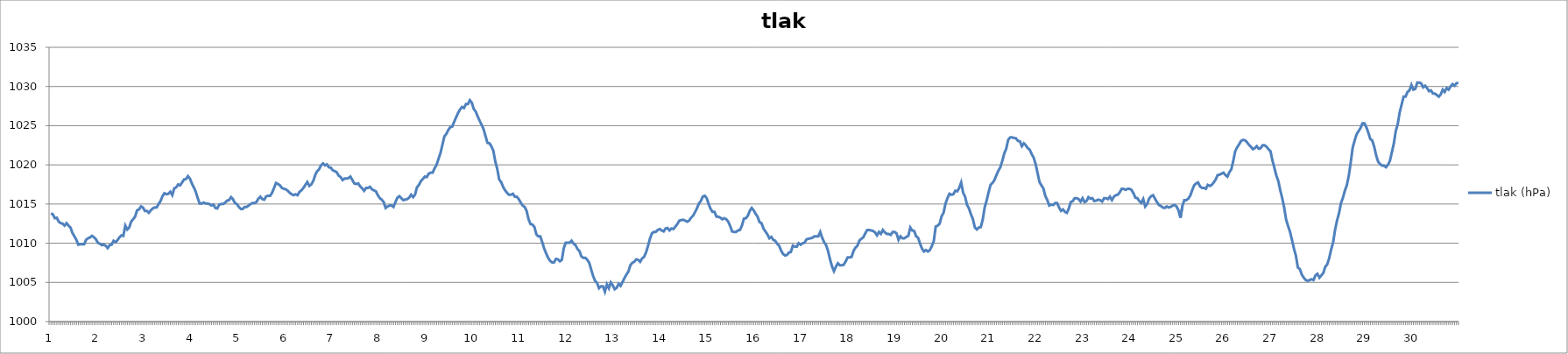
| Category | tlak (hPa) |
|---|---|
| 0 | 1013.81 |
| 1 | 1013.69 |
| 2 | 1013.19 |
| 3 | 1013.25 |
| 4 | 1012.75 |
| 5 | 1012.56 |
| 6 | 1012.5 |
| 7 | 1012.25 |
| 8 | 1012.56 |
| 9 | 1012.25 |
| 10 | 1012 |
| 11 | 1011.31 |
| 12 | 1010.88 |
| 13 | 1010.44 |
| 14 | 1009.81 |
| 15 | 1009.88 |
| 16 | 1009.88 |
| 17 | 1009.88 |
| 18 | 1010.44 |
| 19 | 1010.63 |
| 20 | 1010.75 |
| 21 | 1010.94 |
| 22 | 1010.75 |
| 23 | 1010.5 |
| 24 | 1010.06 |
| 25 | 1009.94 |
| 26 | 1009.75 |
| 27 | 1009.81 |
| 28 | 1009.69 |
| 29 | 1009.38 |
| 30 | 1009.75 |
| 31 | 1009.81 |
| 32 | 1010.31 |
| 33 | 1010.13 |
| 34 | 1010.38 |
| 35 | 1010.75 |
| 36 | 1011 |
| 37 | 1010.94 |
| 38 | 1012.25 |
| 39 | 1011.75 |
| 40 | 1012 |
| 41 | 1012.75 |
| 42 | 1013.06 |
| 43 | 1013.38 |
| 44 | 1014.19 |
| 45 | 1014.31 |
| 46 | 1014.69 |
| 47 | 1014.56 |
| 48 | 1014.13 |
| 49 | 1014.13 |
| 50 | 1013.88 |
| 51 | 1014.19 |
| 52 | 1014.44 |
| 53 | 1014.56 |
| 54 | 1014.56 |
| 55 | 1015 |
| 56 | 1015.38 |
| 57 | 1016 |
| 58 | 1016.38 |
| 59 | 1016.25 |
| 60 | 1016.31 |
| 61 | 1016.56 |
| 62 | 1016.13 |
| 63 | 1017 |
| 64 | 1017.13 |
| 65 | 1017.5 |
| 66 | 1017.38 |
| 67 | 1017.75 |
| 68 | 1018.13 |
| 69 | 1018.19 |
| 70 | 1018.56 |
| 71 | 1018.25 |
| 72 | 1017.63 |
| 73 | 1017.13 |
| 74 | 1016.56 |
| 75 | 1015.75 |
| 76 | 1015.06 |
| 77 | 1015.06 |
| 78 | 1015.19 |
| 79 | 1015.06 |
| 80 | 1015.06 |
| 81 | 1015 |
| 82 | 1014.81 |
| 83 | 1014.94 |
| 84 | 1014.5 |
| 85 | 1014.44 |
| 86 | 1014.94 |
| 87 | 1015 |
| 88 | 1015 |
| 89 | 1015.19 |
| 90 | 1015.44 |
| 91 | 1015.5 |
| 92 | 1015.88 |
| 93 | 1015.63 |
| 94 | 1015.13 |
| 95 | 1015 |
| 96 | 1014.63 |
| 97 | 1014.38 |
| 98 | 1014.38 |
| 99 | 1014.63 |
| 100 | 1014.63 |
| 101 | 1014.81 |
| 102 | 1015 |
| 103 | 1015.13 |
| 104 | 1015.13 |
| 105 | 1015.25 |
| 106 | 1015.69 |
| 107 | 1015.94 |
| 108 | 1015.63 |
| 109 | 1015.56 |
| 110 | 1016 |
| 111 | 1016.06 |
| 112 | 1016.06 |
| 113 | 1016.44 |
| 114 | 1017.06 |
| 115 | 1017.69 |
| 116 | 1017.56 |
| 117 | 1017.38 |
| 118 | 1017.06 |
| 119 | 1016.94 |
| 120 | 1016.88 |
| 121 | 1016.69 |
| 122 | 1016.44 |
| 123 | 1016.25 |
| 124 | 1016.13 |
| 125 | 1016.25 |
| 126 | 1016.13 |
| 127 | 1016.56 |
| 128 | 1016.75 |
| 129 | 1017.06 |
| 130 | 1017.44 |
| 131 | 1017.81 |
| 132 | 1017.31 |
| 133 | 1017.5 |
| 134 | 1017.94 |
| 135 | 1018.69 |
| 136 | 1019.19 |
| 137 | 1019.44 |
| 138 | 1019.94 |
| 139 | 1020.19 |
| 140 | 1019.94 |
| 141 | 1020.06 |
| 142 | 1019.69 |
| 143 | 1019.63 |
| 144 | 1019.31 |
| 145 | 1019.19 |
| 146 | 1019.06 |
| 147 | 1018.63 |
| 148 | 1018.44 |
| 149 | 1018.06 |
| 150 | 1018.25 |
| 151 | 1018.25 |
| 152 | 1018.31 |
| 153 | 1018.5 |
| 154 | 1018.06 |
| 155 | 1017.63 |
| 156 | 1017.56 |
| 157 | 1017.63 |
| 158 | 1017.25 |
| 159 | 1017 |
| 160 | 1016.69 |
| 161 | 1017.06 |
| 162 | 1017.06 |
| 163 | 1017.19 |
| 164 | 1016.88 |
| 165 | 1016.75 |
| 166 | 1016.63 |
| 167 | 1016.13 |
| 168 | 1015.75 |
| 169 | 1015.56 |
| 170 | 1015.25 |
| 171 | 1014.5 |
| 172 | 1014.69 |
| 173 | 1014.81 |
| 174 | 1014.81 |
| 175 | 1014.63 |
| 176 | 1015.25 |
| 177 | 1015.81 |
| 178 | 1016 |
| 179 | 1015.75 |
| 180 | 1015.5 |
| 181 | 1015.56 |
| 182 | 1015.63 |
| 183 | 1015.81 |
| 184 | 1016.19 |
| 185 | 1015.88 |
| 186 | 1016.19 |
| 187 | 1017.13 |
| 188 | 1017.44 |
| 189 | 1017.94 |
| 190 | 1018.19 |
| 191 | 1018.5 |
| 192 | 1018.44 |
| 193 | 1018.88 |
| 194 | 1019 |
| 195 | 1019 |
| 196 | 1019.56 |
| 197 | 1020 |
| 198 | 1020.75 |
| 199 | 1021.5 |
| 200 | 1022.56 |
| 201 | 1023.63 |
| 202 | 1023.94 |
| 203 | 1024.44 |
| 204 | 1024.81 |
| 205 | 1024.88 |
| 206 | 1025.5 |
| 207 | 1026.06 |
| 208 | 1026.63 |
| 209 | 1027.06 |
| 210 | 1027.38 |
| 211 | 1027.25 |
| 212 | 1027.75 |
| 213 | 1027.75 |
| 214 | 1028.25 |
| 215 | 1027.94 |
| 216 | 1027.13 |
| 217 | 1026.81 |
| 218 | 1026.19 |
| 219 | 1025.63 |
| 220 | 1025.13 |
| 221 | 1024.56 |
| 222 | 1023.69 |
| 223 | 1022.81 |
| 224 | 1022.75 |
| 225 | 1022.38 |
| 226 | 1021.81 |
| 227 | 1020.44 |
| 228 | 1019.5 |
| 229 | 1018.13 |
| 230 | 1017.81 |
| 231 | 1017.19 |
| 232 | 1016.75 |
| 233 | 1016.44 |
| 234 | 1016.19 |
| 235 | 1016.19 |
| 236 | 1016.31 |
| 237 | 1015.94 |
| 238 | 1015.94 |
| 239 | 1015.63 |
| 240 | 1015.19 |
| 241 | 1014.81 |
| 242 | 1014.63 |
| 243 | 1014.13 |
| 244 | 1013.06 |
| 245 | 1012.44 |
| 246 | 1012.38 |
| 247 | 1012.06 |
| 248 | 1011.13 |
| 249 | 1010.88 |
| 250 | 1010.88 |
| 251 | 1010.13 |
| 252 | 1009.31 |
| 253 | 1008.69 |
| 254 | 1008.13 |
| 255 | 1007.75 |
| 256 | 1007.56 |
| 257 | 1007.56 |
| 258 | 1008 |
| 259 | 1007.94 |
| 260 | 1007.69 |
| 261 | 1007.88 |
| 262 | 1009.38 |
| 263 | 1010.06 |
| 264 | 1010.06 |
| 265 | 1010.06 |
| 266 | 1010.31 |
| 267 | 1009.94 |
| 268 | 1009.75 |
| 269 | 1009.25 |
| 270 | 1009 |
| 271 | 1008.31 |
| 272 | 1008.13 |
| 273 | 1008.13 |
| 274 | 1007.88 |
| 275 | 1007.5 |
| 276 | 1006.63 |
| 277 | 1005.81 |
| 278 | 1005.19 |
| 279 | 1004.94 |
| 280 | 1004.25 |
| 281 | 1004.5 |
| 282 | 1004.5 |
| 283 | 1003.81 |
| 284 | 1004.75 |
| 285 | 1004.25 |
| 286 | 1005 |
| 287 | 1004.63 |
| 288 | 1004.13 |
| 289 | 1004.31 |
| 290 | 1004.81 |
| 291 | 1004.56 |
| 292 | 1005.06 |
| 293 | 1005.56 |
| 294 | 1006 |
| 295 | 1006.38 |
| 296 | 1007.19 |
| 297 | 1007.5 |
| 298 | 1007.63 |
| 299 | 1007.94 |
| 300 | 1007.88 |
| 301 | 1007.63 |
| 302 | 1008.06 |
| 303 | 1008.25 |
| 304 | 1008.81 |
| 305 | 1009.63 |
| 306 | 1010.56 |
| 307 | 1011.25 |
| 308 | 1011.44 |
| 309 | 1011.44 |
| 310 | 1011.69 |
| 311 | 1011.81 |
| 312 | 1011.63 |
| 313 | 1011.5 |
| 314 | 1011.88 |
| 315 | 1011.94 |
| 316 | 1011.63 |
| 317 | 1011.88 |
| 318 | 1011.81 |
| 319 | 1012.13 |
| 320 | 1012.44 |
| 321 | 1012.88 |
| 322 | 1012.94 |
| 323 | 1013 |
| 324 | 1012.88 |
| 325 | 1012.75 |
| 326 | 1012.88 |
| 327 | 1013.25 |
| 328 | 1013.5 |
| 329 | 1013.94 |
| 330 | 1014.44 |
| 331 | 1015.06 |
| 332 | 1015.38 |
| 333 | 1015.94 |
| 334 | 1016.06 |
| 335 | 1015.75 |
| 336 | 1015 |
| 337 | 1014.38 |
| 338 | 1014 |
| 339 | 1014 |
| 340 | 1013.38 |
| 341 | 1013.38 |
| 342 | 1013.25 |
| 343 | 1013.06 |
| 344 | 1013.19 |
| 345 | 1013.06 |
| 346 | 1012.75 |
| 347 | 1012.19 |
| 348 | 1011.5 |
| 349 | 1011.44 |
| 350 | 1011.44 |
| 351 | 1011.63 |
| 352 | 1011.69 |
| 353 | 1012.25 |
| 354 | 1013.13 |
| 355 | 1013.19 |
| 356 | 1013.5 |
| 357 | 1014.13 |
| 358 | 1014.5 |
| 359 | 1014.19 |
| 360 | 1013.75 |
| 361 | 1013.38 |
| 362 | 1012.69 |
| 363 | 1012.56 |
| 364 | 1011.88 |
| 365 | 1011.5 |
| 366 | 1011.13 |
| 367 | 1010.63 |
| 368 | 1010.81 |
| 369 | 1010.44 |
| 370 | 1010.31 |
| 371 | 1009.94 |
| 372 | 1009.69 |
| 373 | 1009.06 |
| 374 | 1008.63 |
| 375 | 1008.44 |
| 376 | 1008.5 |
| 377 | 1008.81 |
| 378 | 1008.88 |
| 379 | 1009.69 |
| 380 | 1009.56 |
| 381 | 1009.56 |
| 382 | 1010 |
| 383 | 1009.81 |
| 384 | 1010 |
| 385 | 1010.06 |
| 386 | 1010.5 |
| 387 | 1010.56 |
| 388 | 1010.63 |
| 389 | 1010.69 |
| 390 | 1010.88 |
| 391 | 1010.88 |
| 392 | 1010.88 |
| 393 | 1011.44 |
| 394 | 1010.69 |
| 395 | 1010.13 |
| 396 | 1009.75 |
| 397 | 1009 |
| 398 | 1007.94 |
| 399 | 1007.06 |
| 400 | 1006.44 |
| 401 | 1007 |
| 402 | 1007.44 |
| 403 | 1007.19 |
| 404 | 1007.19 |
| 405 | 1007.25 |
| 406 | 1007.69 |
| 407 | 1008.19 |
| 408 | 1008.19 |
| 409 | 1008.25 |
| 410 | 1009 |
| 411 | 1009.44 |
| 412 | 1009.69 |
| 413 | 1010.31 |
| 414 | 1010.56 |
| 415 | 1010.75 |
| 416 | 1011.25 |
| 417 | 1011.69 |
| 418 | 1011.69 |
| 419 | 1011.63 |
| 420 | 1011.56 |
| 421 | 1011.38 |
| 422 | 1011 |
| 423 | 1011.44 |
| 424 | 1011.19 |
| 425 | 1011.69 |
| 426 | 1011.38 |
| 427 | 1011.19 |
| 428 | 1011.19 |
| 429 | 1011.06 |
| 430 | 1011.44 |
| 431 | 1011.44 |
| 432 | 1011.25 |
| 433 | 1010.44 |
| 434 | 1010.88 |
| 435 | 1010.63 |
| 436 | 1010.63 |
| 437 | 1010.81 |
| 438 | 1010.94 |
| 439 | 1012 |
| 440 | 1011.63 |
| 441 | 1011.56 |
| 442 | 1010.88 |
| 443 | 1010.69 |
| 444 | 1009.94 |
| 445 | 1009.31 |
| 446 | 1008.94 |
| 447 | 1009.13 |
| 448 | 1008.94 |
| 449 | 1009.13 |
| 450 | 1009.63 |
| 451 | 1010.25 |
| 452 | 1012.13 |
| 453 | 1012.25 |
| 454 | 1012.5 |
| 455 | 1013.44 |
| 456 | 1013.88 |
| 457 | 1015.06 |
| 458 | 1015.75 |
| 459 | 1016.31 |
| 460 | 1016.19 |
| 461 | 1016.25 |
| 462 | 1016.69 |
| 463 | 1016.63 |
| 464 | 1017.06 |
| 465 | 1017.75 |
| 466 | 1016.44 |
| 467 | 1015.94 |
| 468 | 1014.88 |
| 469 | 1014.44 |
| 470 | 1013.69 |
| 471 | 1013.06 |
| 472 | 1012 |
| 473 | 1011.75 |
| 474 | 1012 |
| 475 | 1012.06 |
| 476 | 1013 |
| 477 | 1014.56 |
| 478 | 1015.44 |
| 479 | 1016.5 |
| 480 | 1017.44 |
| 481 | 1017.69 |
| 482 | 1018.06 |
| 483 | 1018.69 |
| 484 | 1019.25 |
| 485 | 1019.69 |
| 486 | 1020.5 |
| 487 | 1021.44 |
| 488 | 1022.06 |
| 489 | 1023.19 |
| 490 | 1023.5 |
| 491 | 1023.5 |
| 492 | 1023.44 |
| 493 | 1023.38 |
| 494 | 1023.06 |
| 495 | 1023 |
| 496 | 1022.38 |
| 497 | 1022.75 |
| 498 | 1022.5 |
| 499 | 1022.13 |
| 500 | 1021.94 |
| 501 | 1021.38 |
| 502 | 1020.94 |
| 503 | 1020.13 |
| 504 | 1019 |
| 505 | 1017.81 |
| 506 | 1017.38 |
| 507 | 1017 |
| 508 | 1016 |
| 509 | 1015.5 |
| 510 | 1014.81 |
| 511 | 1014.94 |
| 512 | 1014.88 |
| 513 | 1015.13 |
| 514 | 1015.13 |
| 515 | 1014.56 |
| 516 | 1014.13 |
| 517 | 1014.31 |
| 518 | 1014 |
| 519 | 1013.88 |
| 520 | 1014.44 |
| 521 | 1015.25 |
| 522 | 1015.38 |
| 523 | 1015.75 |
| 524 | 1015.75 |
| 525 | 1015.63 |
| 526 | 1015.31 |
| 527 | 1015.75 |
| 528 | 1015.25 |
| 529 | 1015.38 |
| 530 | 1015.88 |
| 531 | 1015.69 |
| 532 | 1015.75 |
| 533 | 1015.38 |
| 534 | 1015.44 |
| 535 | 1015.56 |
| 536 | 1015.5 |
| 537 | 1015.31 |
| 538 | 1015.75 |
| 539 | 1015.75 |
| 540 | 1015.63 |
| 541 | 1015.94 |
| 542 | 1015.5 |
| 543 | 1015.94 |
| 544 | 1016.13 |
| 545 | 1016.19 |
| 546 | 1016.5 |
| 547 | 1016.94 |
| 548 | 1016.94 |
| 549 | 1016.81 |
| 550 | 1016.94 |
| 551 | 1016.94 |
| 552 | 1016.81 |
| 553 | 1016.38 |
| 554 | 1015.81 |
| 555 | 1015.75 |
| 556 | 1015.38 |
| 557 | 1015.13 |
| 558 | 1015.63 |
| 559 | 1014.69 |
| 560 | 1015 |
| 561 | 1015.69 |
| 562 | 1016 |
| 563 | 1016.13 |
| 564 | 1015.69 |
| 565 | 1015.25 |
| 566 | 1014.88 |
| 567 | 1014.75 |
| 568 | 1014.56 |
| 569 | 1014.5 |
| 570 | 1014.69 |
| 571 | 1014.56 |
| 572 | 1014.63 |
| 573 | 1014.81 |
| 574 | 1014.88 |
| 575 | 1014.69 |
| 576 | 1014.19 |
| 577 | 1013.25 |
| 578 | 1014.75 |
| 579 | 1015.5 |
| 580 | 1015.5 |
| 581 | 1015.69 |
| 582 | 1016.06 |
| 583 | 1016.75 |
| 584 | 1017.38 |
| 585 | 1017.63 |
| 586 | 1017.75 |
| 587 | 1017.25 |
| 588 | 1017.06 |
| 589 | 1017.06 |
| 590 | 1016.94 |
| 591 | 1017.44 |
| 592 | 1017.31 |
| 593 | 1017.44 |
| 594 | 1017.75 |
| 595 | 1018.13 |
| 596 | 1018.69 |
| 597 | 1018.75 |
| 598 | 1018.88 |
| 599 | 1019 |
| 600 | 1018.69 |
| 601 | 1018.5 |
| 602 | 1019.06 |
| 603 | 1019.44 |
| 604 | 1020.5 |
| 605 | 1021.75 |
| 606 | 1022.25 |
| 607 | 1022.63 |
| 608 | 1023.06 |
| 609 | 1023.19 |
| 610 | 1023.13 |
| 611 | 1022.88 |
| 612 | 1022.56 |
| 613 | 1022.31 |
| 614 | 1022 |
| 615 | 1022.13 |
| 616 | 1022.38 |
| 617 | 1022.06 |
| 618 | 1022.13 |
| 619 | 1022.5 |
| 620 | 1022.5 |
| 621 | 1022.31 |
| 622 | 1022 |
| 623 | 1021.75 |
| 624 | 1020.56 |
| 625 | 1019.63 |
| 626 | 1018.63 |
| 627 | 1017.94 |
| 628 | 1016.75 |
| 629 | 1015.75 |
| 630 | 1014.56 |
| 631 | 1013 |
| 632 | 1012.19 |
| 633 | 1011.44 |
| 634 | 1010.4 |
| 635 | 1009.3 |
| 636 | 1008.4 |
| 637 | 1006.9 |
| 638 | 1006.7 |
| 639 | 1006 |
| 640 | 1005.6 |
| 641 | 1005.3 |
| 642 | 1005.2 |
| 643 | 1005.3 |
| 644 | 1005.4 |
| 645 | 1005.3 |
| 646 | 1005.9 |
| 647 | 1006.1 |
| 648 | 1005.6 |
| 649 | 1005.9 |
| 650 | 1006.2 |
| 651 | 1007 |
| 652 | 1007.3 |
| 653 | 1008.1 |
| 654 | 1009.2 |
| 655 | 1010.1 |
| 656 | 1011.7 |
| 657 | 1012.9 |
| 658 | 1013.8 |
| 659 | 1015.1 |
| 660 | 1015.8 |
| 661 | 1016.7 |
| 662 | 1017.4 |
| 663 | 1018.6 |
| 664 | 1020.3 |
| 665 | 1022.2 |
| 666 | 1023.1 |
| 667 | 1023.9 |
| 668 | 1024.3 |
| 669 | 1024.7 |
| 670 | 1025.3 |
| 671 | 1025.3 |
| 672 | 1024.8 |
| 673 | 1024.1 |
| 674 | 1023.3 |
| 675 | 1023.1 |
| 676 | 1022.3 |
| 677 | 1021.2 |
| 678 | 1020.4 |
| 679 | 1020.1 |
| 680 | 1019.9 |
| 681 | 1019.9 |
| 682 | 1019.7 |
| 683 | 1020 |
| 684 | 1020.5 |
| 685 | 1021.6 |
| 686 | 1022.7 |
| 687 | 1024.3 |
| 688 | 1025.2 |
| 689 | 1026.7 |
| 690 | 1027.7 |
| 691 | 1028.7 |
| 692 | 1028.7 |
| 693 | 1029.3 |
| 694 | 1029.5 |
| 695 | 1030.2 |
| 696 | 1029.6 |
| 697 | 1029.7 |
| 698 | 1030.5 |
| 699 | 1030.5 |
| 700 | 1030.4 |
| 701 | 1029.9 |
| 702 | 1030.1 |
| 703 | 1029.8 |
| 704 | 1029.4 |
| 705 | 1029.5 |
| 706 | 1029.1 |
| 707 | 1029.1 |
| 708 | 1028.9 |
| 709 | 1028.7 |
| 710 | 1029 |
| 711 | 1029.6 |
| 712 | 1029.3 |
| 713 | 1029.8 |
| 714 | 1029.6 |
| 715 | 1030 |
| 716 | 1030.3 |
| 717 | 1030.1 |
| 718 | 1030.4 |
| 719 | 1030.5 |